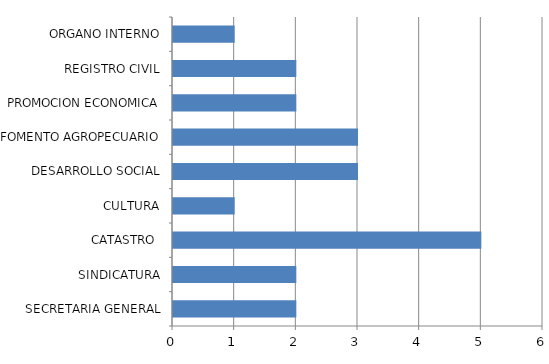
| Category | Series 0 |
|---|---|
| SECRETARIA GENERAL | 2 |
| SINDICATURA | 2 |
| CATASTRO  | 5 |
| CULTURA | 1 |
| DESARROLLO SOCIAL | 3 |
| FOMENTO AGROPECUARIO | 3 |
| PROMOCION ECONOMICA | 2 |
| REGISTRO CIVIL | 2 |
| ORGANO INTERNO | 1 |